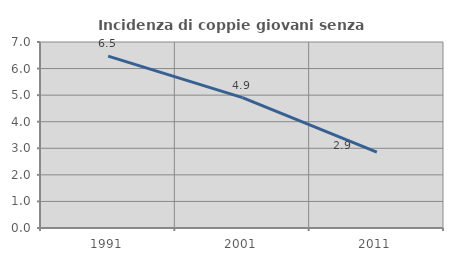
| Category | Incidenza di coppie giovani senza figli |
|---|---|
| 1991.0 | 6.468 |
| 2001.0 | 4.907 |
| 2011.0 | 2.857 |